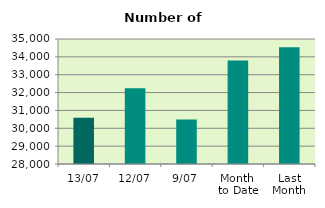
| Category | Series 0 |
|---|---|
| 13/07 | 30596 |
| 12/07 | 32236 |
| 9/07 | 30490 |
| Month 
to Date | 33791.111 |
| Last
Month | 34545 |